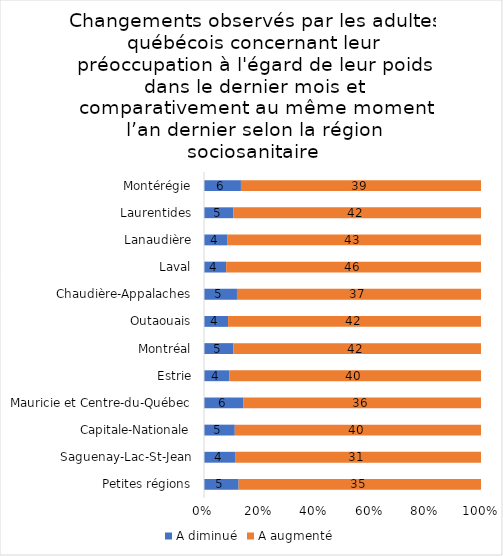
| Category | A diminué | A augmenté |
|---|---|---|
| Petites régions | 5 | 35 |
| Saguenay-Lac-St-Jean | 4 | 31 |
| Capitale-Nationale | 5 | 40 |
| Mauricie et Centre-du-Québec | 6 | 36 |
| Estrie | 4 | 40 |
| Montréal | 5 | 42 |
| Outaouais | 4 | 42 |
| Chaudière-Appalaches | 5 | 37 |
| Laval | 4 | 46 |
| Lanaudière | 4 | 43 |
| Laurentides | 5 | 42 |
| Montérégie | 6 | 39 |